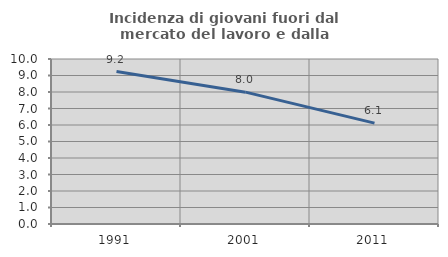
| Category | Incidenza di giovani fuori dal mercato del lavoro e dalla formazione  |
|---|---|
| 1991.0 | 9.237 |
| 2001.0 | 7.991 |
| 2011.0 | 6.112 |